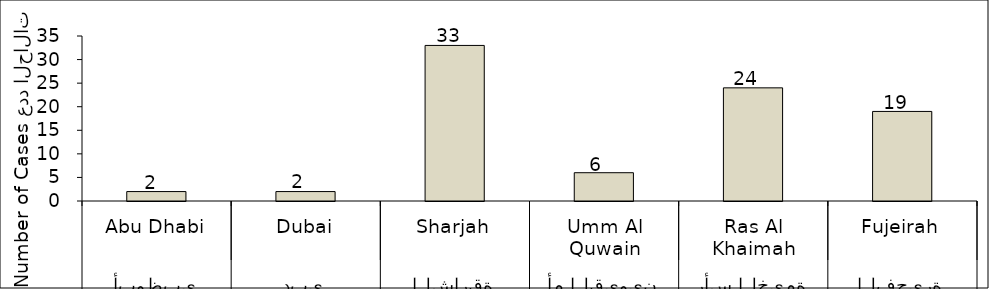
| Category | Series 0 |
|---|---|
| 0 | 2 |
| 1 | 2 |
| 2 | 33 |
| 3 | 6 |
| 4 | 24 |
| 5 | 19 |